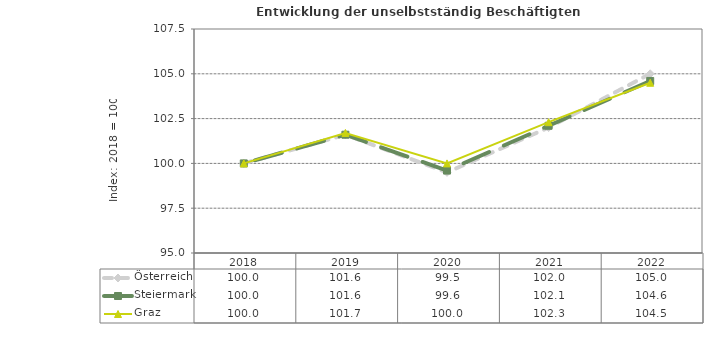
| Category | Österreich | Steiermark | Graz |
|---|---|---|---|
| 2022.0 | 105 | 104.6 | 104.5 |
| 2021.0 | 102 | 102.1 | 102.3 |
| 2020.0 | 99.5 | 99.6 | 100 |
| 2019.0 | 101.6 | 101.6 | 101.7 |
| 2018.0 | 100 | 100 | 100 |